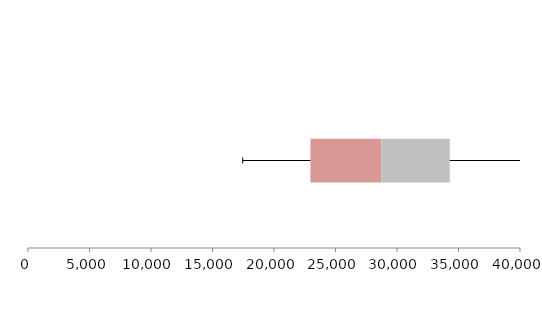
| Category | Series 1 | Series 2 | Series 3 |
|---|---|---|---|
| 0 | 22965.709 | 5749.216 | 5572.228 |